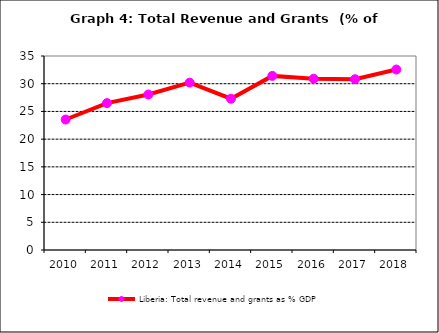
| Category | Liberia: Total revenue and grants as % GDP |
|---|---|
| 2010.0 | 23.542 |
| 2011.0 | 26.497 |
| 2012.0 | 28.049 |
| 2013.0 | 30.198 |
| 2014.0 | 27.296 |
| 2015.0 | 31.411 |
| 2016.0 | 30.904 |
| 2017.0 | 30.809 |
| 2018.0 | 32.563 |